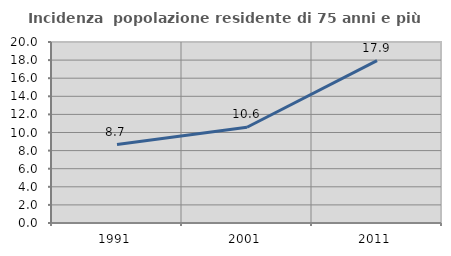
| Category | Incidenza  popolazione residente di 75 anni e più |
|---|---|
| 1991.0 | 8.67 |
| 2001.0 | 10.578 |
| 2011.0 | 17.947 |